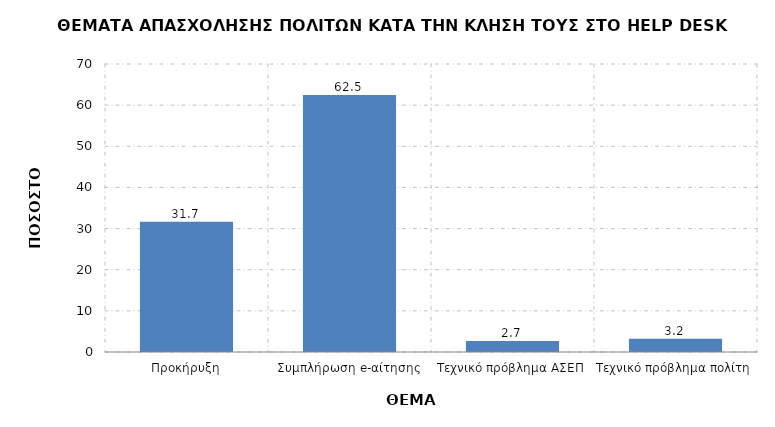
| Category | Ποσοστό |
|---|---|
| Προκήρυξη | 31.656 |
| Συμπλήρωση e-αίτησης | 62.489 |
| Τεχνικό πρόβλημα ΑΣΕΠ | 2.653 |
| Τεχνικό πρόβλημα πολίτη | 3.202 |